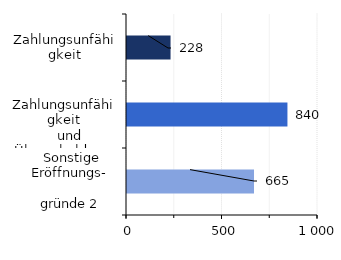
| Category | Series 0 |
|---|---|
| Zahlungsunfähigkeit | 228 |
|   Zahlungsunfähigkeit
   und Überschuldung | 840 |
|  Sonstige Eröffnungs-
                      gründe 2 | 665 |